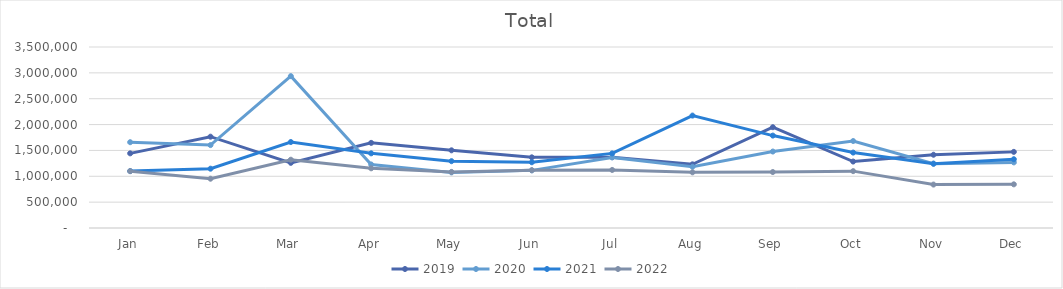
| Category | 2019 | 2020 | 2021 | 2022 |
|---|---|---|---|---|
| Jan | 1443510 | 1659105 | 1100978 | 1098881 |
| Feb | 1765726 | 1603249 | 1146630 | 953204 |
| Mar | 1259874 | 2936558 | 1662446 | 1320474 |
| Apr | 1645986 | 1228629 | 1443891 | 1154190 |
| May | 1502303 | 1075378 | 1292191 | 1084498 |
| Jun | 1366451 | 1114346 | 1271194 | 1117545 |
| Jul | 1370032 | 1365029 | 1442400 | 1122520 |
| Aug | 1231156 | 1184009 | 2173807 | 1076655 |
| Sep | 1949190 | 1478428 | 1786984 | 1082178 |
| Oct | 1285088 | 1681586 | 1458194 | 1099537 |
| Nov | 1416409 | 1243679 | 1243313 | 839780 |
| Dec | 1472047 | 1268507 | 1329736 | 844439 |